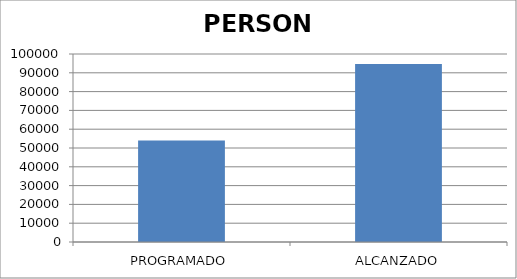
| Category | PERSONA |
|---|---|
| PROGRAMADO | 54000 |
| ALCANZADO | 94688 |